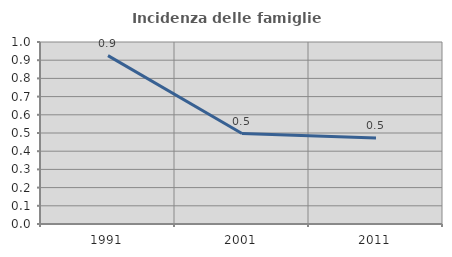
| Category | Incidenza delle famiglie numerose |
|---|---|
| 1991.0 | 0.925 |
| 2001.0 | 0.497 |
| 2011.0 | 0.472 |